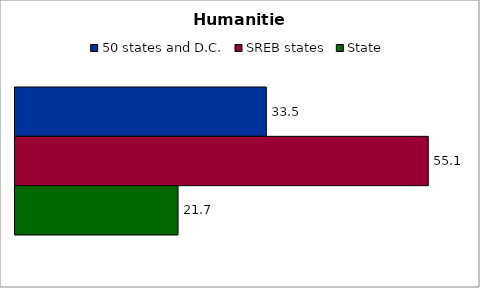
| Category | 50 states and D.C. | SREB states | State |
|---|---|---|---|
| Humanities | 33.51 | 55.102 | 21.739 |